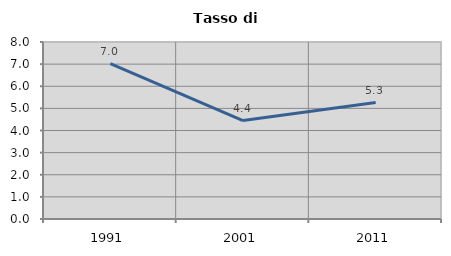
| Category | Tasso di disoccupazione   |
|---|---|
| 1991.0 | 7.019 |
| 2001.0 | 4.448 |
| 2011.0 | 5.262 |